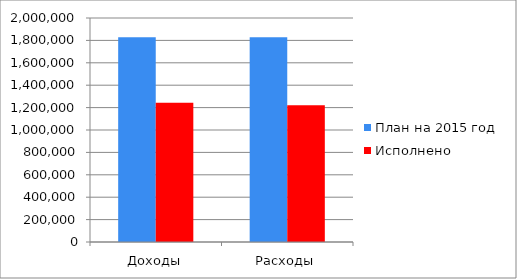
| Category | План на 2015 год | Исполнено  |
|---|---|---|
| Доходы | 1828378 | 1243638 |
| Расходы | 1828526 | 1220275 |